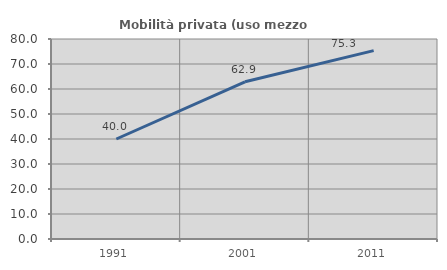
| Category | Mobilità privata (uso mezzo privato) |
|---|---|
| 1991.0 | 40 |
| 2001.0 | 62.881 |
| 2011.0 | 75.341 |